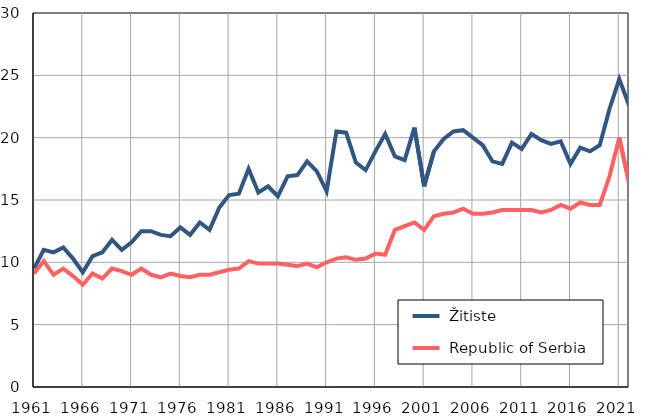
| Category |  Žitiste |  Republic of Serbia |
|---|---|---|
| 1961.0 | 9.5 | 9.1 |
| 1962.0 | 11 | 10.1 |
| 1963.0 | 10.8 | 9 |
| 1964.0 | 11.2 | 9.5 |
| 1965.0 | 10.3 | 8.9 |
| 1966.0 | 9.2 | 8.2 |
| 1967.0 | 10.5 | 9.1 |
| 1968.0 | 10.8 | 8.7 |
| 1969.0 | 11.8 | 9.5 |
| 1970.0 | 11 | 9.3 |
| 1971.0 | 11.6 | 9 |
| 1972.0 | 12.5 | 9.5 |
| 1973.0 | 12.5 | 9 |
| 1974.0 | 12.2 | 8.8 |
| 1975.0 | 12.1 | 9.1 |
| 1976.0 | 12.8 | 8.9 |
| 1977.0 | 12.2 | 8.8 |
| 1978.0 | 13.2 | 9 |
| 1979.0 | 12.6 | 9 |
| 1980.0 | 14.4 | 9.2 |
| 1981.0 | 15.4 | 9.4 |
| 1982.0 | 15.5 | 9.5 |
| 1983.0 | 17.5 | 10.1 |
| 1984.0 | 15.6 | 9.9 |
| 1985.0 | 16.1 | 9.9 |
| 1986.0 | 15.3 | 9.9 |
| 1987.0 | 16.9 | 9.8 |
| 1988.0 | 17 | 9.7 |
| 1989.0 | 18.1 | 9.9 |
| 1990.0 | 17.3 | 9.6 |
| 1991.0 | 15.7 | 10 |
| 1992.0 | 20.5 | 10.3 |
| 1993.0 | 20.4 | 10.4 |
| 1994.0 | 18 | 10.2 |
| 1995.0 | 17.4 | 10.3 |
| 1996.0 | 18.9 | 10.7 |
| 1997.0 | 20.3 | 10.6 |
| 1998.0 | 18.5 | 12.6 |
| 1999.0 | 18.2 | 12.9 |
| 2000.0 | 20.8 | 13.2 |
| 2001.0 | 16.1 | 12.6 |
| 2002.0 | 18.9 | 13.7 |
| 2003.0 | 19.9 | 13.9 |
| 2004.0 | 20.5 | 14 |
| 2005.0 | 20.6 | 14.3 |
| 2006.0 | 20 | 13.9 |
| 2007.0 | 19.4 | 13.9 |
| 2008.0 | 18.1 | 14 |
| 2009.0 | 17.9 | 14.2 |
| 2010.0 | 19.6 | 14.2 |
| 2011.0 | 19.1 | 14.2 |
| 2012.0 | 20.3 | 14.2 |
| 2013.0 | 19.8 | 14 |
| 2014.0 | 19.5 | 14.2 |
| 2015.0 | 19.7 | 14.6 |
| 2016.0 | 17.9 | 14.3 |
| 2017.0 | 19.2 | 14.8 |
| 2018.0 | 18.9 | 14.6 |
| 2019.0 | 19.4 | 14.6 |
| 2020.0 | 22.3 | 16.9 |
| 2021.0 | 24.7 | 20 |
| 2022.0 | 22.6 | 16.4 |